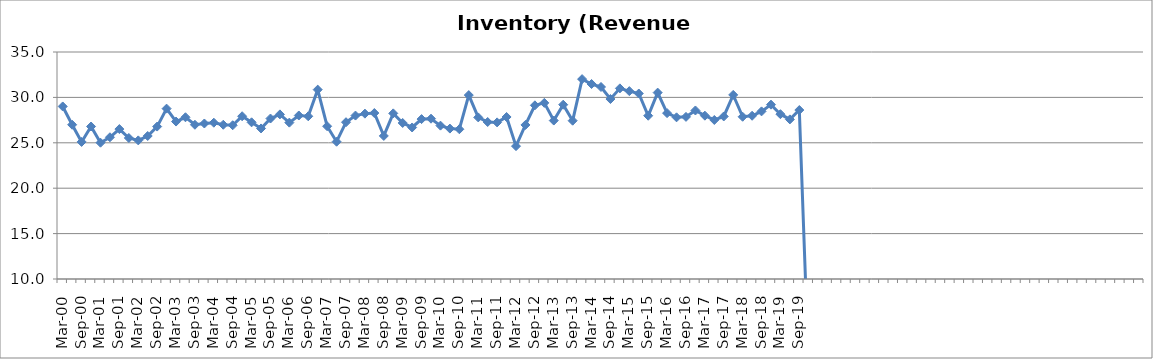
| Category | Inventory (Revenue Days) |
|---|---|
| Mar-00 | 29.002 |
| Jun-00 | 26.989 |
| Sep-00 | 25.098 |
| Dec-00 | 26.794 |
| Mar-01 | 25.009 |
| Jun-01 | 25.609 |
| Sep-01 | 26.512 |
| Dec-01 | 25.53 |
| Mar-02 | 25.266 |
| Jun-02 | 25.75 |
| Sep-02 | 26.787 |
| Dec-02 | 28.763 |
| Mar-03 | 27.339 |
| Jun-03 | 27.813 |
| Sep-03 | 26.987 |
| Dec-03 | 27.126 |
| Mar-04 | 27.214 |
| Jun-04 | 26.988 |
| Sep-04 | 26.934 |
| Dec-04 | 27.925 |
| Mar-05 | 27.256 |
| Jun-05 | 26.58 |
| Sep-05 | 27.673 |
| Dec-05 | 28.13 |
| Mar-06 | 27.221 |
| Jun-06 | 28.007 |
| Sep-06 | 27.922 |
| Dec-06 | 30.853 |
| Mar-07 | 26.824 |
| Jun-07 | 25.118 |
| Sep-07 | 27.267 |
| Dec-07 | 28 |
| Mar-08 | 28.21 |
| Jun-08 | 28.278 |
| Sep-08 | 25.755 |
| Dec-08 | 28.242 |
| Mar-09 | 27.183 |
| Jun-09 | 26.688 |
| Sep-09 | 27.612 |
| Dec-09 | 27.655 |
| Mar-10 | 26.891 |
| Jun-10 | 26.566 |
| Sep-10 | 26.493 |
| Dec-10 | 30.253 |
| Mar-11 | 27.797 |
| Jun-11 | 27.29 |
| Sep-11 | 27.249 |
| Dec-11 | 27.842 |
| Mar-12 | 24.632 |
| Jun-12 | 26.967 |
| Sep-12 | 29.127 |
| Dec-12 | 29.395 |
| Mar-13 | 27.45 |
| Jun-13 | 29.194 |
| Sep-13 | 27.434 |
| Dec-13 | 32.013 |
| Mar-14 | 31.474 |
| Jun-14 | 31.147 |
| Sep-14 | 29.821 |
| Dec-14 | 30.995 |
| Mar-15 | 30.691 |
| Jun-15 | 30.427 |
| Sep-15 | 27.981 |
| Dec-15 | 30.527 |
| Mar-16 | 28.268 |
| Jun-16 | 27.805 |
| Sep-16 | 27.856 |
| Dec-16 | 28.56 |
| Mar-17 | 27.989 |
| Jun-17 | 27.514 |
| Sep-17 | 27.901 |
| Dec-17 | 30.275 |
| Mar-18 | 27.868 |
| Jun-18 | 27.978 |
| Sep-18 | 28.462 |
| Dec-18 | 29.201 |
| Mar-19 | 28.151 |
| Jun-19 | 27.577 |
| Sep-19 | 28.609 |